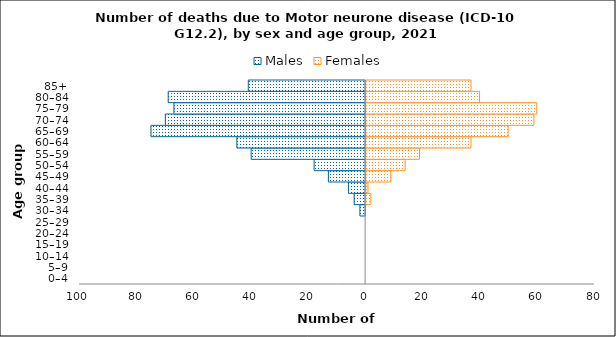
| Category | Males | Females |
|---|---|---|
| 0–4 | 0 | 0 |
| 5–9 | 0 | 0 |
| 10–14 | 0 | 0 |
| 15–19 | 0 | 0 |
| 20–24 | 0 | 0 |
| 25–29 | 0 | 0 |
| 30–34 | -2 | 0 |
| 35–39 | -4 | 2 |
| 40–44 | -6 | 1 |
| 45–49 | -13 | 9 |
| 50–54 | -18 | 14 |
| 55–59 | -40 | 19 |
| 60–64 | -45 | 37 |
| 65–69 | -75 | 50 |
| 70–74 | -70 | 59 |
| 75–79 | -67 | 60 |
| 80–84 | -69 | 40 |
| 85+ | -41 | 37 |